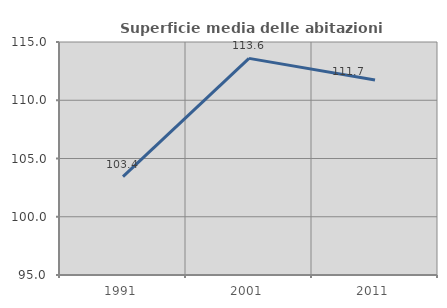
| Category | Superficie media delle abitazioni occupate |
|---|---|
| 1991.0 | 103.448 |
| 2001.0 | 113.595 |
| 2011.0 | 111.746 |